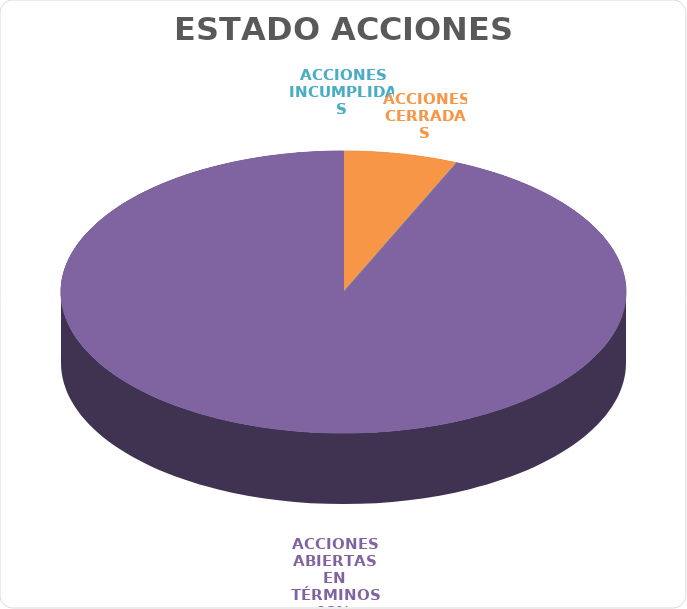
| Category | Series 0 |
|---|---|
| ACCIONES CERRADAS | 4 |
| ACCIONES INCUMPLIDAS | 0 |
| ACCIONES ABIERTAS EN TÉRMINOS | 57 |